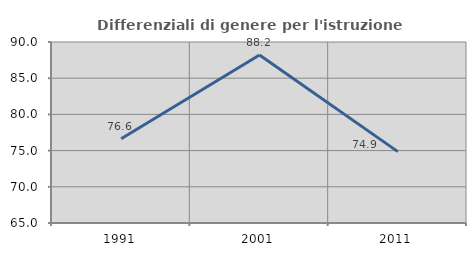
| Category | Differenziali di genere per l'istruzione superiore |
|---|---|
| 1991.0 | 76.632 |
| 2001.0 | 88.204 |
| 2011.0 | 74.859 |